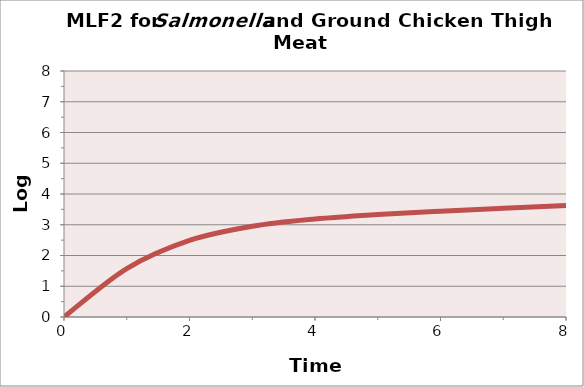
| Category | Series 0 |
|---|---|
| 0.0 | 0 |
| 1.0 | 1.574 |
| 2.0 | 2.491 |
| 3.0 | 2.95 |
| 4.0 | 3.188 |
| 5.0 | 3.333 |
| 6.0 | 3.442 |
| 7.0 | 3.536 |
| 8.0 | 3.623 |